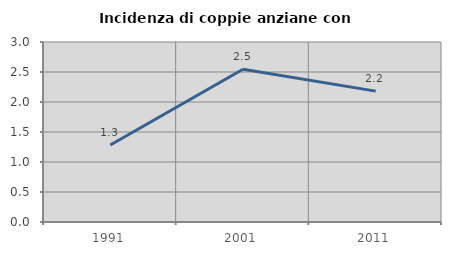
| Category | Incidenza di coppie anziane con figli |
|---|---|
| 1991.0 | 1.284 |
| 2001.0 | 2.547 |
| 2011.0 | 2.181 |